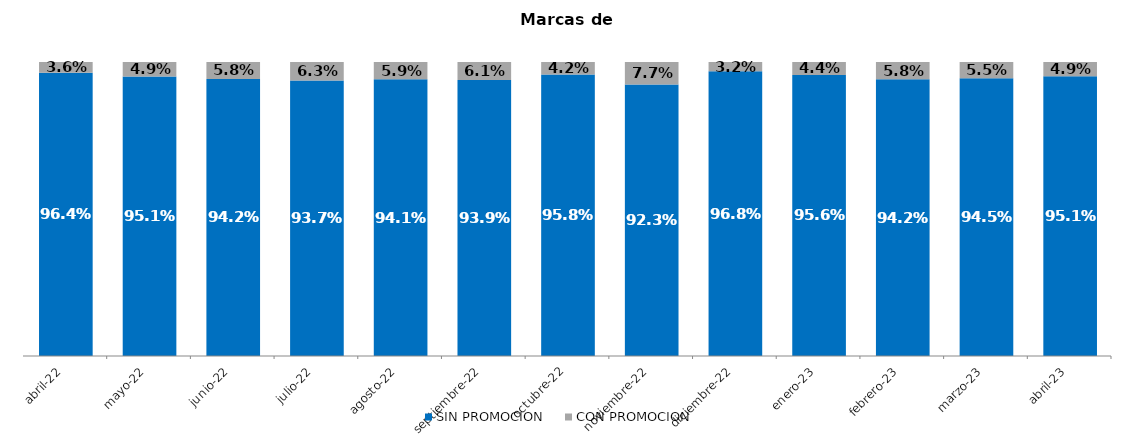
| Category | SIN PROMOCION   | CON PROMOCION   |
|---|---|---|
| 2022-04-01 | 0.964 | 0.036 |
| 2022-05-01 | 0.951 | 0.049 |
| 2022-06-01 | 0.942 | 0.058 |
| 2022-07-01 | 0.937 | 0.063 |
| 2022-08-01 | 0.941 | 0.059 |
| 2022-09-01 | 0.939 | 0.061 |
| 2022-10-01 | 0.958 | 0.042 |
| 2022-11-01 | 0.923 | 0.077 |
| 2022-12-01 | 0.968 | 0.032 |
| 2023-01-01 | 0.956 | 0.044 |
| 2023-02-01 | 0.942 | 0.058 |
| 2023-03-01 | 0.945 | 0.055 |
| 2023-04-01 | 0.951 | 0.049 |